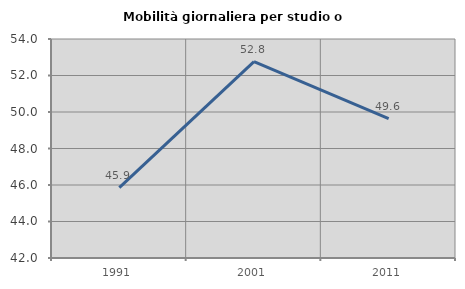
| Category | Mobilità giornaliera per studio o lavoro |
|---|---|
| 1991.0 | 45.858 |
| 2001.0 | 52.759 |
| 2011.0 | 49.64 |